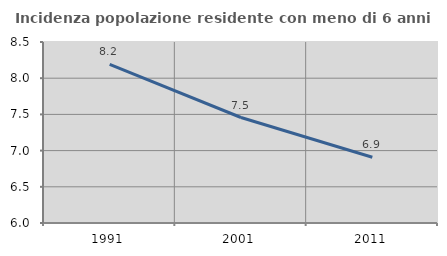
| Category | Incidenza popolazione residente con meno di 6 anni |
|---|---|
| 1991.0 | 8.191 |
| 2001.0 | 7.457 |
| 2011.0 | 6.909 |